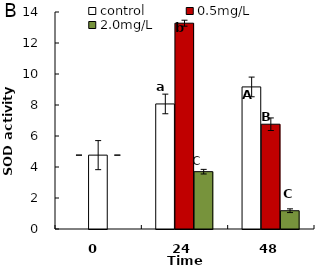
| Category | control | 0.5mg/L | 2.0mg/L |
|---|---|---|---|
| 0.0 | 4.765 | 4.765 | 4.765 |
| 24.0 | 8.068 | 13.278 | 3.699 |
| 48.0 | 9.166 | 6.76 | 1.179 |